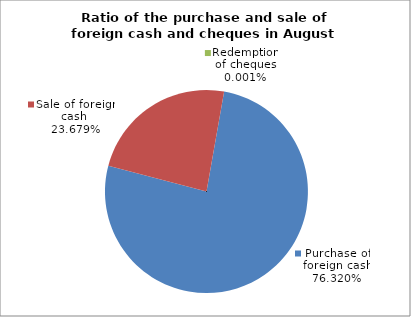
| Category | Purchase of foreign cash |
|---|---|
| 0 | 0.763 |
| 1 | 0.237 |
| 2 | 0 |